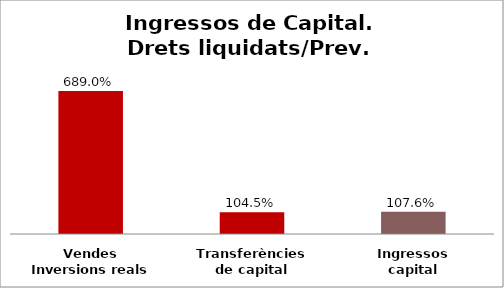
| Category | Series 0 |
|---|---|
| Vendes Inversions reals | 6.89 |
| Transferències de capital | 1.045 |
| Ingressos capital | 1.076 |